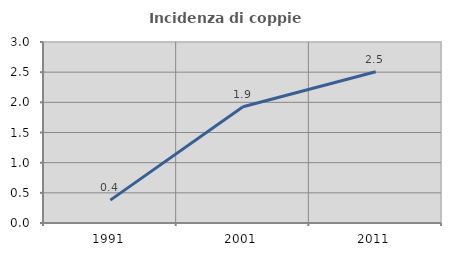
| Category | Incidenza di coppie miste |
|---|---|
| 1991.0 | 0.38 |
| 2001.0 | 1.927 |
| 2011.0 | 2.507 |